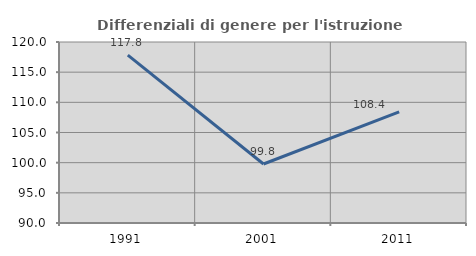
| Category | Differenziali di genere per l'istruzione superiore |
|---|---|
| 1991.0 | 117.83 |
| 2001.0 | 99.782 |
| 2011.0 | 108.432 |